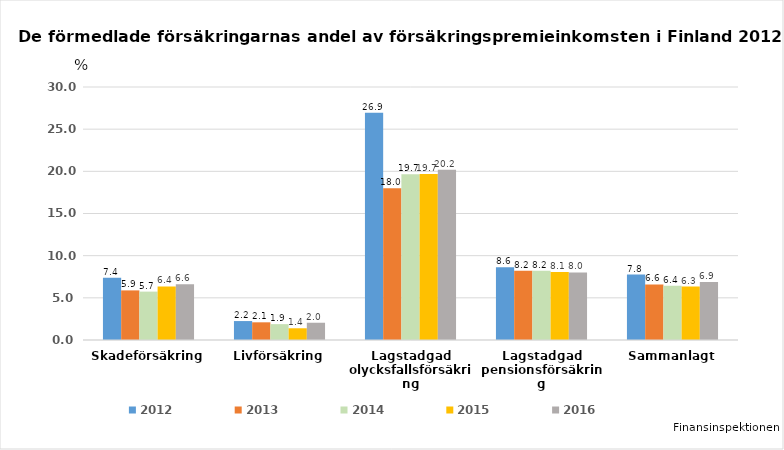
| Category | 2012 | 2013 | 2014 | 2015 | 2016 |
|---|---|---|---|---|---|
| Skadeförsäkring | 7.375 | 5.882 | 5.737 | 6.356 | 6.621 |
| Livförsäkring | 2.246 | 2.097 | 1.88 | 1.39 | 2.047 |
| Lagstadgad olycksfallsförsäkring | 26.944 | 17.98 | 19.654 | 19.692 | 20.194 |
| Lagstadgad pensionsförsäkring | 8.637 | 8.204 | 8.203 | 8.075 | 8.016 |
| Sammanlagt | 7.754 | 6.584 | 6.436 | 6.337 | 6.875 |